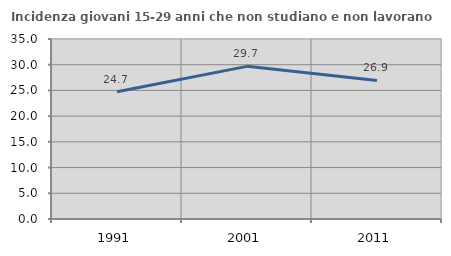
| Category | Incidenza giovani 15-29 anni che non studiano e non lavorano  |
|---|---|
| 1991.0 | 24.731 |
| 2001.0 | 29.681 |
| 2011.0 | 26.947 |